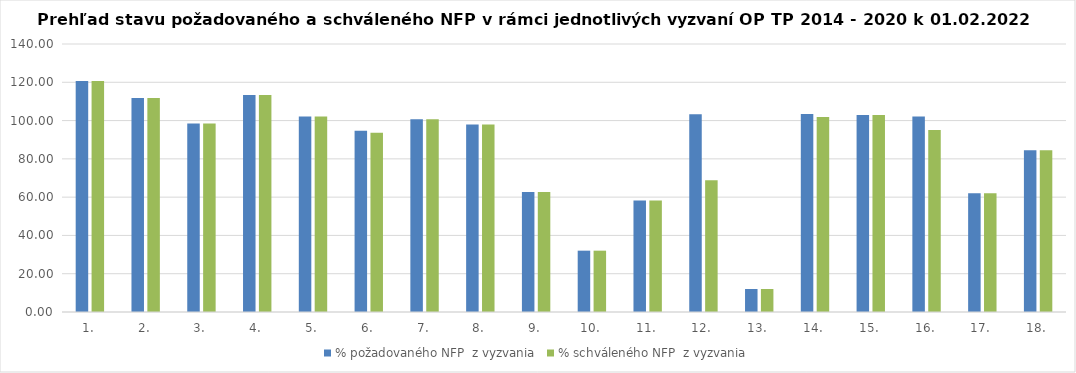
| Category | % požadovaného NFP  z vyzvania | % schváleného NFP  z vyzvania |
|---|---|---|
| 1. | 120.662 | 120.662 |
| 2. | 111.83 | 111.83 |
| 3. | 98.465 | 98.465 |
| 4. | 113.295 | 113.295 |
| 5. | 102.19 | 102.19 |
| 6. | 94.643 | 93.673 |
| 7. | 100.637 | 100.637 |
| 8. | 97.989 | 97.989 |
| 9. | 62.721 | 62.721 |
| 10. | 32.038 | 32.038 |
| 11. | 58.283 | 58.283 |
| 12. | 103.242 | 68.88 |
| 13. | 12.008 | 12.008 |
| 14. | 103.392 | 101.839 |
| 15. | 102.872 | 102.872 |
| 16. | 102.176 | 95.126 |
| 17. | 61.969 | 61.969 |
| 18. | 84.514 | 84.514 |